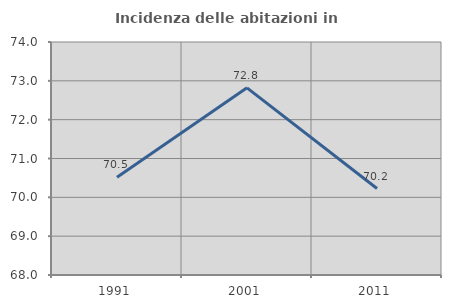
| Category | Incidenza delle abitazioni in proprietà  |
|---|---|
| 1991.0 | 70.52 |
| 2001.0 | 72.82 |
| 2011.0 | 70.227 |